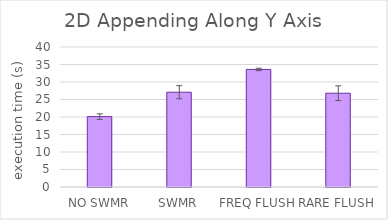
| Category | 2D Appending in Y |
|---|---|
| NO SWMR | 20.115 |
| SWMR | 27.078 |
| FREQ FLUSH | 33.591 |
| RARE FLUSH | 26.799 |